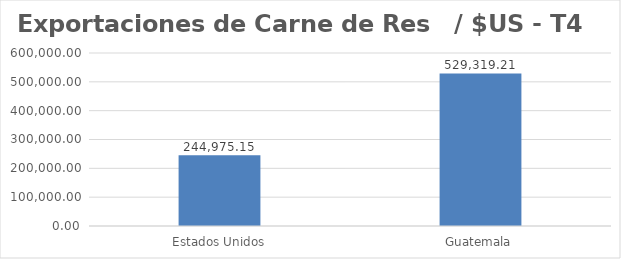
| Category | Series 0 |
|---|---|
| Estados Unidos | 244975.15 |
| Guatemala | 529319.21 |